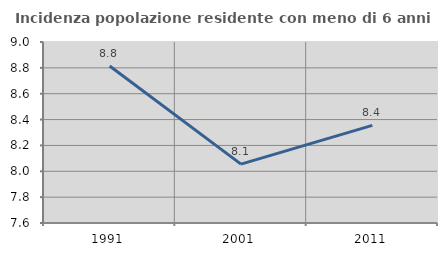
| Category | Incidenza popolazione residente con meno di 6 anni |
|---|---|
| 1991.0 | 8.815 |
| 2001.0 | 8.055 |
| 2011.0 | 8.355 |